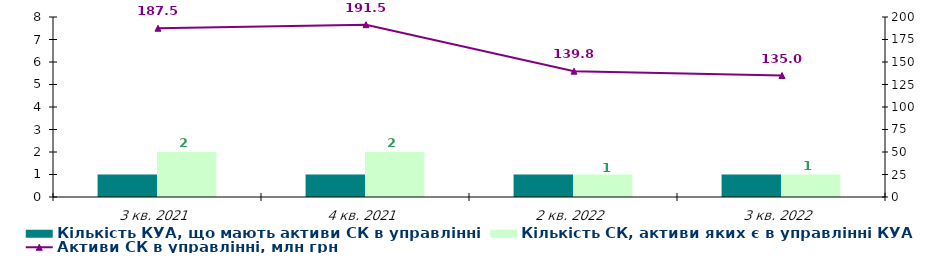
| Category | Кількість КУА, що мають активи СК в управлінні | Кількість СК, активи яких є в управлінні КУА |
|---|---|---|
| 3 кв. 2021 | 1 | 2 |
| 4 кв. 2021 | 1 | 2 |
| 2 кв. 2022 | 1 | 1 |
| 3 кв. 2022 | 1 | 1 |